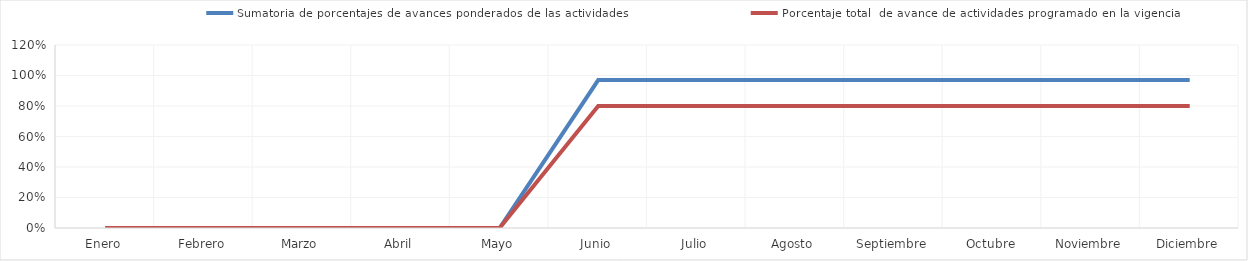
| Category | Sumatoria de porcentajes de avances ponderados de las actividades | Porcentaje total  de avance de actividades programado en la vigencia |
|---|---|---|
| 0 | 0 | 0 |
| 1 | 0 | 0 |
| 2 | 0 | 0 |
| 3 | 0 | 0 |
| 4 | 0 | 0 |
| 5 | 0.97 | 0.8 |
| 6 | 0.97 | 0.8 |
| 7 | 0.97 | 0.8 |
| 8 | 0.97 | 0.8 |
| 9 | 0.97 | 0.8 |
| 10 | 0.97 | 0.8 |
| 11 | 0.97 | 0.8 |